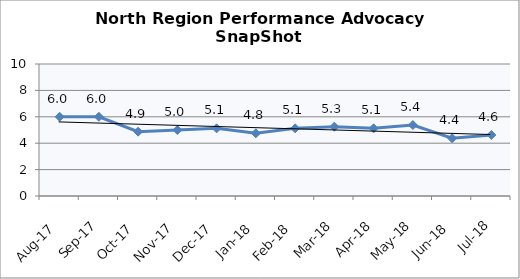
| Category | North Region |
|---|---|
| Aug-17 | 6 |
| Sep-17 | 6 |
| Oct-17 | 4.875 |
| Nov-17 | 5 |
| Dec-17 | 5.125 |
| Jan-18 | 4.75 |
| Feb-18 | 5.125 |
| Mar-18 | 5.25 |
| Apr-18 | 5.125 |
| May-18 | 5.375 |
| Jun-18 | 4.375 |
| Jul-18 | 4.625 |